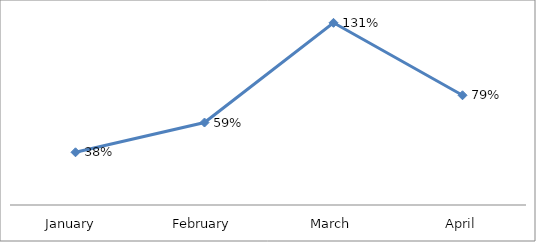
| Category | PERCENTAGE |
|---|---|
| January  | 0.379 |
| February | 0.592 |
| March | 1.308 |
| April | 0.788 |